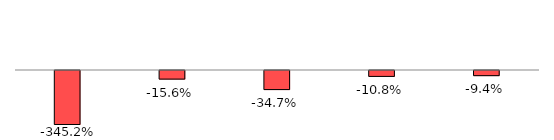
| Category | Series 1 |
|---|---|
| Profit/Loss | -3.452 |
| Income | -0.156 |
| Expenditure (Excl. Admin) | -0.347 |
| Personal Exp | -0.108 |
| Other Exp | -0.094 |